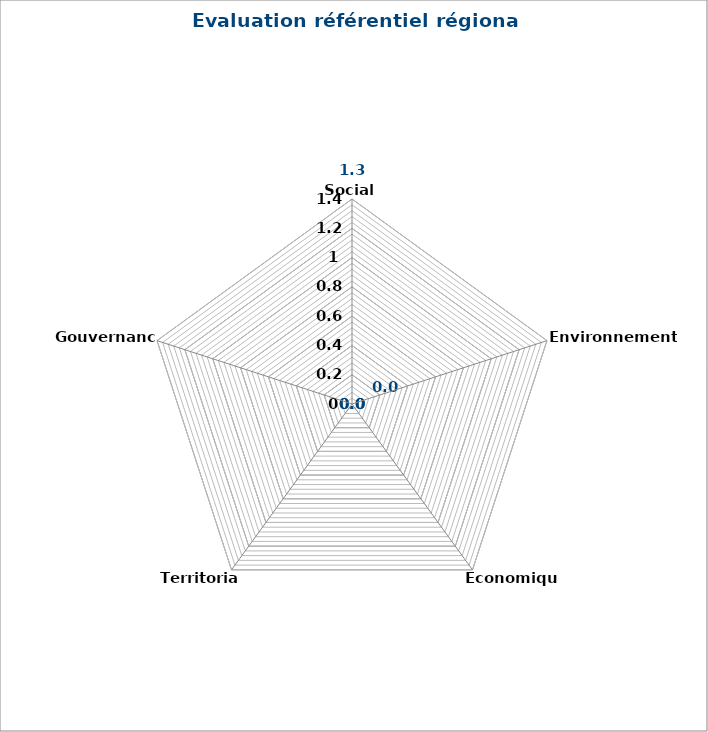
| Category | Series 0 |
|---|---|
| Social  | 1.333 |
| Environnemental | 0 |
| Economique | 0 |
| Territorial | 0 |
| Gouvernance | 0 |